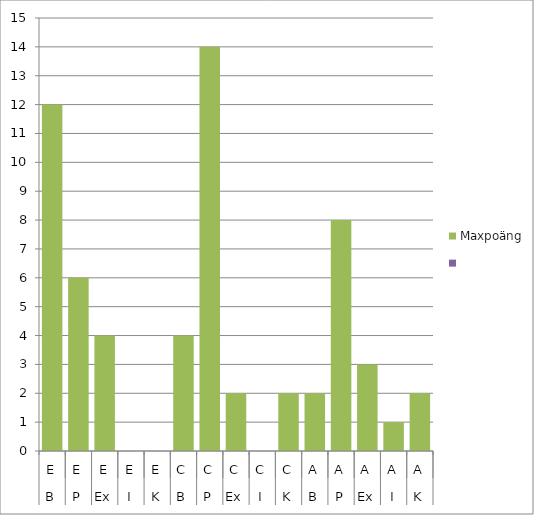
| Category | Maxpoäng | Series 3 |
|---|---|---|
| 0 | 12 | 0 |
| 1 | 6 | 0 |
| 2 | 4 | 0 |
| 3 | 0 | 0 |
| 4 | 0 | 0 |
| 5 | 4 | 0 |
| 6 | 14 | 0 |
| 7 | 2 | 0 |
| 8 | 0 | 0 |
| 9 | 2 | 0 |
| 10 | 2 | 0 |
| 11 | 8 | 0 |
| 12 | 3 | 0 |
| 13 | 1 | 0 |
| 14 | 2 | 0 |